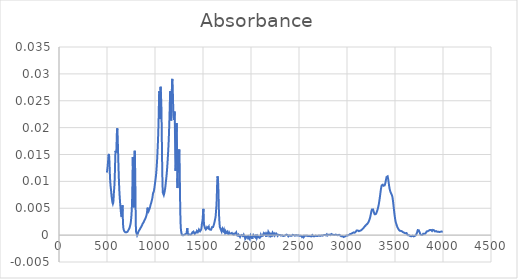
| Category | Absorbance |
|---|---|
| 3997.70514 | 0.001 |
| 3995.77668 | 0.001 |
| 3993.84822 | 0.001 |
| 3991.91975 | 0.001 |
| 3989.99129 | 0.001 |
| 3988.06283 | 0.001 |
| 3986.13436 | 0.001 |
| 3984.2059 | 0.001 |
| 3982.27743 | 0.001 |
| 3980.34897 | 0.001 |
| 3978.42051 | 0.001 |
| 3976.49204 | 0.001 |
| 3974.56358 | 0.001 |
| 3972.63512 | 0.001 |
| 3970.70665 | 0.001 |
| 3968.77819 | 0.001 |
| 3966.84973 | 0.001 |
| 3964.92126 | 0.001 |
| 3962.9928 | 0.001 |
| 3961.06433 | 0.001 |
| 3959.13587 | 0.001 |
| 3957.20741 | 0.001 |
| 3955.27894 | 0.001 |
| 3953.35048 | 0.001 |
| 3951.42202 | 0.001 |
| 3949.49355 | 0.001 |
| 3947.56509 | 0.001 |
| 3945.63663 | 0.001 |
| 3943.70816 | 0.001 |
| 3941.7797 | 0.001 |
| 3939.85123 | 0.001 |
| 3937.92277 | 0.001 |
| 3935.99431 | 0.001 |
| 3934.06584 | 0.001 |
| 3932.13738 | 0.001 |
| 3930.20892 | 0.001 |
| 3928.28045 | 0.001 |
| 3926.35199 | 0.001 |
| 3924.42353 | 0.001 |
| 3922.49506 | 0.001 |
| 3920.5666 | 0.001 |
| 3918.63813 | 0.001 |
| 3916.70967 | 0.001 |
| 3914.78121 | 0.001 |
| 3912.85274 | 0.001 |
| 3910.92428 | 0.001 |
| 3908.99582 | 0.001 |
| 3907.06735 | 0.001 |
| 3905.13889 | 0.001 |
| 3903.21043 | 0.001 |
| 3901.28196 | 0.001 |
| 3899.3535 | 0.001 |
| 3897.42503 | 0.001 |
| 3895.49657 | 0.001 |
| 3893.56811 | 0.001 |
| 3891.63964 | 0.001 |
| 3889.71118 | 0.001 |
| 3887.78272 | 0.001 |
| 3885.85425 | 0.001 |
| 3883.92579 | 0.001 |
| 3881.99733 | 0.001 |
| 3880.06886 | 0.001 |
| 3878.1404 | 0.001 |
| 3876.21193 | 0.001 |
| 3874.28347 | 0.001 |
| 3872.35501 | 0.001 |
| 3870.42654 | 0.001 |
| 3868.49808 | 0.001 |
| 3866.56962 | 0.001 |
| 3864.64115 | 0.001 |
| 3862.71269 | 0.001 |
| 3860.78422 | 0.001 |
| 3858.85576 | 0.001 |
| 3856.9273 | 0.001 |
| 3854.99883 | 0.001 |
| 3853.07037 | 0.001 |
| 3851.14191 | 0.001 |
| 3849.21344 | 0.001 |
| 3847.28498 | 0.001 |
| 3845.35652 | 0.001 |
| 3843.42805 | 0.001 |
| 3841.49959 | 0.001 |
| 3839.57112 | 0.001 |
| 3837.64266 | 0.001 |
| 3835.7142 | 0.001 |
| 3833.78573 | 0.001 |
| 3831.85727 | 0.001 |
| 3829.92881 | 0.001 |
| 3828.00034 | 0.001 |
| 3826.07188 | 0.001 |
| 3824.14342 | 0.001 |
| 3822.21495 | 0 |
| 3820.28649 | 0 |
| 3818.35802 | 0 |
| 3816.42956 | 0 |
| 3814.5011 | 0 |
| 3812.57263 | 0 |
| 3810.64417 | 0 |
| 3808.71571 | 0 |
| 3806.78724 | 0 |
| 3804.85878 | 0 |
| 3802.93032 | 0 |
| 3801.00185 | 0 |
| 3799.07339 | 0 |
| 3797.14492 | 0 |
| 3795.21646 | 0 |
| 3793.288 | 0 |
| 3791.35953 | 0 |
| 3789.43107 | 0 |
| 3787.50261 | 0 |
| 3785.57414 | 0 |
| 3783.64568 | 0 |
| 3781.71722 | 0 |
| 3779.78875 | 0 |
| 3777.86029 | 0 |
| 3775.93182 | 0 |
| 3774.00336 | 0 |
| 3772.0749 | 0 |
| 3770.14643 | 0 |
| 3768.21797 | 0 |
| 3766.28951 | 0 |
| 3764.36104 | 0 |
| 3762.43258 | 0 |
| 3760.50412 | 0 |
| 3758.57565 | 0 |
| 3756.64719 | 0.001 |
| 3754.71872 | 0.001 |
| 3752.79026 | 0.001 |
| 3750.8618 | 0.001 |
| 3748.93333 | 0.001 |
| 3747.00487 | 0.001 |
| 3745.07641 | 0.001 |
| 3743.14794 | 0.001 |
| 3741.21948 | 0.001 |
| 3739.29102 | 0.001 |
| 3737.36255 | 0.001 |
| 3735.43409 | 0.001 |
| 3733.50562 | 0.001 |
| 3731.57716 | 0.001 |
| 3729.6487 | 0 |
| 3727.72023 | 0 |
| 3725.79177 | 0 |
| 3723.86331 | 0 |
| 3721.93484 | 0 |
| 3720.00638 | 0 |
| 3718.07791 | 0 |
| 3716.14945 | 0 |
| 3714.22099 | 0 |
| 3712.29252 | 0 |
| 3710.36406 | 0 |
| 3708.4356 | 0 |
| 3706.50713 | 0 |
| 3704.57867 | 0 |
| 3702.65021 | 0 |
| 3700.72174 | 0 |
| 3698.79328 | 0 |
| 3696.86481 | 0 |
| 3694.93635 | 0 |
| 3693.00789 | 0 |
| 3691.07942 | 0 |
| 3689.15096 | 0 |
| 3687.2225 | 0 |
| 3685.29403 | 0 |
| 3683.36557 | 0 |
| 3681.43711 | 0 |
| 3679.50864 | 0 |
| 3677.58018 | 0 |
| 3675.65171 | 0 |
| 3673.72325 | 0 |
| 3671.79479 | 0 |
| 3669.86632 | 0 |
| 3667.93786 | 0 |
| 3666.0094 | 0 |
| 3664.08093 | 0 |
| 3662.15247 | 0 |
| 3660.22401 | 0 |
| 3658.29554 | 0 |
| 3656.36708 | 0 |
| 3654.43861 | 0 |
| 3652.51015 | 0 |
| 3650.58169 | 0 |
| 3648.65322 | 0 |
| 3646.72476 | 0 |
| 3644.7963 | 0 |
| 3642.86783 | 0 |
| 3640.93937 | 0 |
| 3639.01091 | 0 |
| 3637.08244 | 0 |
| 3635.15398 | 0 |
| 3633.22551 | 0 |
| 3631.29705 | 0 |
| 3629.36859 | 0 |
| 3627.44012 | 0 |
| 3625.51166 | 0 |
| 3623.5832 | 0 |
| 3621.65473 | 0 |
| 3619.72627 | 0 |
| 3617.79781 | 0 |
| 3615.86934 | 0 |
| 3613.94088 | 0 |
| 3612.01241 | 0 |
| 3610.08395 | 0 |
| 3608.15549 | 0 |
| 3606.22702 | 0 |
| 3604.29856 | 0 |
| 3602.3701 | 0 |
| 3600.44163 | 0 |
| 3598.51317 | 0 |
| 3596.58471 | 0 |
| 3594.65624 | 0 |
| 3592.72778 | 0 |
| 3590.79931 | 0.001 |
| 3588.87085 | 0.001 |
| 3586.94239 | 0.001 |
| 3585.01392 | 0.001 |
| 3583.08546 | 0.001 |
| 3581.157 | 0.001 |
| 3579.22853 | 0.001 |
| 3577.30007 | 0.001 |
| 3575.3716 | 0.001 |
| 3573.44314 | 0.001 |
| 3571.51468 | 0.001 |
| 3569.58621 | 0.001 |
| 3567.65775 | 0.001 |
| 3565.72929 | 0.001 |
| 3563.80082 | 0.001 |
| 3561.87236 | 0.001 |
| 3559.9439 | 0.001 |
| 3558.01543 | 0.001 |
| 3556.08697 | 0.001 |
| 3554.1585 | 0.001 |
| 3552.23004 | 0.001 |
| 3550.30158 | 0.001 |
| 3548.37311 | 0.001 |
| 3546.44465 | 0.001 |
| 3544.51619 | 0.001 |
| 3542.58772 | 0.001 |
| 3540.65926 | 0.001 |
| 3538.7308 | 0.001 |
| 3536.80233 | 0.001 |
| 3534.87387 | 0.001 |
| 3532.9454 | 0.001 |
| 3531.01694 | 0.001 |
| 3529.08848 | 0.001 |
| 3527.16001 | 0.001 |
| 3525.23155 | 0.001 |
| 3523.30309 | 0.002 |
| 3521.37462 | 0.002 |
| 3519.44616 | 0.002 |
| 3517.5177 | 0.002 |
| 3515.58923 | 0.002 |
| 3513.66077 | 0.002 |
| 3511.7323 | 0.002 |
| 3509.80384 | 0.002 |
| 3507.87538 | 0.002 |
| 3505.94691 | 0.003 |
| 3504.01845 | 0.003 |
| 3502.08999 | 0.003 |
| 3500.16152 | 0.003 |
| 3498.23306 | 0.003 |
| 3496.3046 | 0.004 |
| 3494.37613 | 0.004 |
| 3492.44767 | 0.004 |
| 3490.5192 | 0.005 |
| 3488.59074 | 0.005 |
| 3486.66228 | 0.005 |
| 3484.73381 | 0.005 |
| 3482.80535 | 0.006 |
| 3480.87689 | 0.006 |
| 3478.94842 | 0.006 |
| 3477.01996 | 0.007 |
| 3475.0915 | 0.007 |
| 3473.16303 | 0.007 |
| 3471.23457 | 0.007 |
| 3469.3061 | 0.007 |
| 3467.37764 | 0.007 |
| 3465.44918 | 0.008 |
| 3463.52071 | 0.008 |
| 3461.59225 | 0.008 |
| 3459.66379 | 0.008 |
| 3457.73532 | 0.008 |
| 3455.80686 | 0.008 |
| 3453.8784 | 0.008 |
| 3451.94993 | 0.008 |
| 3450.02147 | 0.008 |
| 3448.093 | 0.008 |
| 3446.16454 | 0.008 |
| 3444.23608 | 0.009 |
| 3442.30761 | 0.009 |
| 3440.37915 | 0.009 |
| 3438.45069 | 0.009 |
| 3436.52222 | 0.009 |
| 3434.59376 | 0.01 |
| 3432.66529 | 0.01 |
| 3430.73683 | 0.01 |
| 3428.80837 | 0.01 |
| 3426.8799 | 0.011 |
| 3424.95144 | 0.011 |
| 3423.02298 | 0.011 |
| 3421.09451 | 0.011 |
| 3419.16605 | 0.011 |
| 3417.23759 | 0.011 |
| 3415.30912 | 0.011 |
| 3413.38066 | 0.011 |
| 3411.45219 | 0.011 |
| 3409.52373 | 0.011 |
| 3407.59527 | 0.01 |
| 3405.6668 | 0.01 |
| 3403.73834 | 0.01 |
| 3401.80988 | 0.01 |
| 3399.88141 | 0.01 |
| 3397.95295 | 0.01 |
| 3396.02449 | 0.009 |
| 3394.09602 | 0.009 |
| 3392.16756 | 0.009 |
| 3390.23909 | 0.009 |
| 3388.31063 | 0.009 |
| 3386.38217 | 0.009 |
| 3384.4537 | 0.009 |
| 3382.52524 | 0.009 |
| 3380.59678 | 0.009 |
| 3378.66831 | 0.009 |
| 3376.73985 | 0.009 |
| 3374.81139 | 0.009 |
| 3372.88292 | 0.009 |
| 3370.95446 | 0.009 |
| 3369.02599 | 0.009 |
| 3367.09753 | 0.009 |
| 3365.16907 | 0.009 |
| 3363.2406 | 0.009 |
| 3361.31214 | 0.009 |
| 3359.38368 | 0.009 |
| 3357.45521 | 0.009 |
| 3355.52675 | 0.009 |
| 3353.59829 | 0.009 |
| 3351.66982 | 0.008 |
| 3349.74136 | 0.008 |
| 3347.81289 | 0.008 |
| 3345.88443 | 0.008 |
| 3343.95597 | 0.007 |
| 3342.0275 | 0.007 |
| 3340.09904 | 0.007 |
| 3338.17058 | 0.007 |
| 3336.24211 | 0.006 |
| 3334.31365 | 0.006 |
| 3332.38519 | 0.006 |
| 3330.45672 | 0.006 |
| 3328.52826 | 0.005 |
| 3326.59979 | 0.005 |
| 3324.67133 | 0.005 |
| 3322.74287 | 0.005 |
| 3320.8144 | 0.005 |
| 3318.88594 | 0.005 |
| 3316.95748 | 0.005 |
| 3315.02901 | 0.005 |
| 3313.10055 | 0.004 |
| 3311.17208 | 0.004 |
| 3309.24362 | 0.004 |
| 3307.31516 | 0.004 |
| 3305.38669 | 0.004 |
| 3303.45823 | 0.004 |
| 3301.52977 | 0.004 |
| 3299.6013 | 0.004 |
| 3297.67284 | 0.004 |
| 3295.74438 | 0.004 |
| 3293.81591 | 0.004 |
| 3291.88745 | 0.004 |
| 3289.95898 | 0.004 |
| 3288.03052 | 0.004 |
| 3286.10206 | 0.004 |
| 3284.17359 | 0.004 |
| 3282.24513 | 0.004 |
| 3280.31667 | 0.004 |
| 3278.3882 | 0.004 |
| 3276.45974 | 0.004 |
| 3274.53128 | 0.005 |
| 3272.60281 | 0.005 |
| 3270.67435 | 0.005 |
| 3268.74588 | 0.005 |
| 3266.81742 | 0.005 |
| 3264.88896 | 0.005 |
| 3262.96049 | 0.005 |
| 3261.03203 | 0.005 |
| 3259.10357 | 0.005 |
| 3257.1751 | 0.005 |
| 3255.24664 | 0.005 |
| 3253.31818 | 0.004 |
| 3251.38971 | 0.004 |
| 3249.46125 | 0.004 |
| 3247.53278 | 0.004 |
| 3245.60432 | 0.004 |
| 3243.67586 | 0.004 |
| 3241.74739 | 0.003 |
| 3239.81893 | 0.003 |
| 3237.89047 | 0.003 |
| 3235.962 | 0.003 |
| 3234.03354 | 0.003 |
| 3232.10508 | 0.003 |
| 3230.17661 | 0.003 |
| 3228.24815 | 0.003 |
| 3226.31968 | 0.003 |
| 3224.39122 | 0.002 |
| 3222.46276 | 0.002 |
| 3220.53429 | 0.002 |
| 3218.60583 | 0.002 |
| 3216.67737 | 0.002 |
| 3214.7489 | 0.002 |
| 3212.82044 | 0.002 |
| 3210.89198 | 0.002 |
| 3208.96351 | 0.002 |
| 3207.03505 | 0.002 |
| 3205.10658 | 0.002 |
| 3203.17812 | 0.002 |
| 3201.24966 | 0.002 |
| 3199.32119 | 0.002 |
| 3197.39273 | 0.002 |
| 3195.46427 | 0.002 |
| 3193.5358 | 0.002 |
| 3191.60734 | 0.002 |
| 3189.67888 | 0.002 |
| 3187.75041 | 0.002 |
| 3185.82195 | 0.002 |
| 3183.89348 | 0.002 |
| 3181.96502 | 0.002 |
| 3180.03656 | 0.002 |
| 3178.10809 | 0.001 |
| 3176.17963 | 0.001 |
| 3174.25117 | 0.001 |
| 3172.3227 | 0.001 |
| 3170.39424 | 0.001 |
| 3168.46577 | 0.001 |
| 3166.53731 | 0.001 |
| 3164.60885 | 0.001 |
| 3162.68038 | 0.001 |
| 3160.75192 | 0.001 |
| 3158.82346 | 0.001 |
| 3156.89499 | 0.001 |
| 3154.96653 | 0.001 |
| 3153.03807 | 0.001 |
| 3151.1096 | 0.001 |
| 3149.18114 | 0.001 |
| 3147.25267 | 0.001 |
| 3145.32421 | 0.001 |
| 3143.39575 | 0.001 |
| 3141.46728 | 0.001 |
| 3139.53882 | 0.001 |
| 3137.61036 | 0.001 |
| 3135.68189 | 0.001 |
| 3133.75343 | 0.001 |
| 3131.82497 | 0.001 |
| 3129.8965 | 0.001 |
| 3127.96804 | 0.001 |
| 3126.03957 | 0.001 |
| 3124.11111 | 0.001 |
| 3122.18265 | 0.001 |
| 3120.25418 | 0.001 |
| 3118.32572 | 0.001 |
| 3116.39726 | 0.001 |
| 3114.46879 | 0.001 |
| 3112.54033 | 0.001 |
| 3110.61187 | 0.001 |
| 3108.6834 | 0.001 |
| 3106.75494 | 0.001 |
| 3104.82647 | 0.001 |
| 3102.89801 | 0.001 |
| 3100.96955 | 0.001 |
| 3099.04108 | 0.001 |
| 3097.11262 | 0.001 |
| 3095.18416 | 0.001 |
| 3093.25569 | 0.001 |
| 3091.32723 | 0.001 |
| 3089.39877 | 0.001 |
| 3087.4703 | 0.001 |
| 3085.54184 | 0 |
| 3083.61337 | 0 |
| 3081.68491 | 0 |
| 3079.75645 | 0 |
| 3077.82798 | 0 |
| 3075.89952 | 0 |
| 3073.97106 | 0 |
| 3072.04259 | 0 |
| 3070.11413 | 0 |
| 3068.18567 | 0.001 |
| 3066.2572 | 0.001 |
| 3064.32874 | 0 |
| 3062.40027 | 0 |
| 3060.47181 | 0 |
| 3058.54335 | 0 |
| 3056.61488 | 0 |
| 3054.68642 | 0 |
| 3052.75796 | 0 |
| 3050.82949 | 0 |
| 3048.90103 | 0 |
| 3046.97257 | 0 |
| 3045.0441 | 0 |
| 3043.11564 | 0 |
| 3041.18717 | 0 |
| 3039.25871 | 0 |
| 3037.33025 | 0 |
| 3035.40178 | 0 |
| 3033.47332 | 0 |
| 3031.54486 | 0 |
| 3029.61639 | 0 |
| 3027.68793 | 0 |
| 3025.75946 | 0 |
| 3023.831 | 0 |
| 3021.90254 | 0 |
| 3019.97407 | 0 |
| 3018.04561 | 0 |
| 3016.11715 | 0 |
| 3014.18868 | 0 |
| 3012.26022 | 0 |
| 3010.33176 | 0 |
| 3008.40329 | 0 |
| 3006.47483 | 0 |
| 3004.54636 | 0 |
| 3002.6179 | 0 |
| 3000.68944 | 0 |
| 2998.76097 | 0 |
| 2996.83251 | 0 |
| 2994.90405 | 0 |
| 2992.97558 | 0 |
| 2991.04712 | 0 |
| 2989.11866 | 0 |
| 2987.19019 | 0 |
| 2985.26173 | 0 |
| 2983.33326 | 0 |
| 2981.4048 | 0 |
| 2979.47634 | 0 |
| 2977.54787 | 0 |
| 2975.61941 | 0 |
| 2973.69095 | 0 |
| 2971.76248 | 0 |
| 2969.83402 | 0 |
| 2967.90556 | 0 |
| 2965.97709 | 0 |
| 2964.04863 | 0 |
| 2962.12016 | 0 |
| 2960.1917 | 0 |
| 2958.26324 | 0 |
| 2956.33477 | 0 |
| 2954.40631 | 0 |
| 2952.47785 | 0 |
| 2950.54938 | 0 |
| 2948.62092 | 0 |
| 2946.69246 | 0 |
| 2944.76399 | 0 |
| 2942.83553 | 0 |
| 2940.90706 | 0 |
| 2938.9786 | 0 |
| 2937.05014 | 0 |
| 2935.12167 | 0 |
| 2933.19321 | 0 |
| 2931.26475 | 0 |
| 2929.33628 | 0 |
| 2927.40782 | 0 |
| 2925.47936 | 0 |
| 2923.55089 | 0 |
| 2921.62243 | 0 |
| 2919.69396 | 0 |
| 2917.7655 | 0 |
| 2915.83704 | 0 |
| 2913.90857 | 0 |
| 2911.98011 | 0 |
| 2910.05165 | 0 |
| 2908.12318 | 0 |
| 2906.19472 | 0 |
| 2904.26626 | 0 |
| 2902.33779 | 0 |
| 2900.40933 | 0 |
| 2898.48086 | 0 |
| 2896.5524 | 0 |
| 2894.62394 | 0 |
| 2892.69547 | 0 |
| 2890.76701 | 0 |
| 2888.83855 | 0 |
| 2886.91008 | 0 |
| 2884.98162 | 0 |
| 2883.05315 | 0 |
| 2881.12469 | 0 |
| 2879.19623 | 0 |
| 2877.26776 | 0 |
| 2875.3393 | 0 |
| 2873.41084 | 0 |
| 2871.48237 | 0 |
| 2869.55391 | 0 |
| 2867.62545 | 0 |
| 2865.69698 | 0 |
| 2863.76852 | 0 |
| 2861.84005 | 0 |
| 2859.91159 | 0 |
| 2857.98313 | 0 |
| 2856.05466 | 0 |
| 2854.1262 | 0 |
| 2852.19774 | 0 |
| 2850.26927 | 0 |
| 2848.34081 | 0 |
| 2846.41235 | 0 |
| 2844.48388 | 0 |
| 2842.55542 | 0 |
| 2840.62695 | 0 |
| 2838.69849 | 0 |
| 2836.77003 | 0 |
| 2834.84156 | 0 |
| 2832.9131 | 0 |
| 2830.98464 | 0 |
| 2829.05617 | 0 |
| 2827.12771 | 0 |
| 2825.19925 | 0 |
| 2823.27078 | 0 |
| 2821.34232 | 0 |
| 2819.41385 | 0 |
| 2817.48539 | 0 |
| 2815.55693 | 0 |
| 2813.62846 | 0 |
| 2811.7 | 0 |
| 2809.77154 | 0 |
| 2807.84307 | 0 |
| 2805.91461 | 0 |
| 2803.98615 | 0 |
| 2802.05768 | 0 |
| 2800.12922 | 0 |
| 2798.20075 | 0 |
| 2796.27229 | 0 |
| 2794.34383 | 0 |
| 2792.41536 | 0 |
| 2790.4869 | 0 |
| 2788.55844 | 0 |
| 2786.62997 | 0 |
| 2784.70151 | 0 |
| 2782.77305 | 0 |
| 2780.84458 | 0 |
| 2778.91612 | 0 |
| 2776.98765 | 0 |
| 2775.05919 | 0 |
| 2773.13073 | 0 |
| 2771.20226 | 0 |
| 2769.2738 | 0 |
| 2767.34534 | 0 |
| 2765.41687 | 0 |
| 2763.48841 | 0 |
| 2761.55995 | 0 |
| 2759.63148 | 0 |
| 2757.70302 | 0 |
| 2755.77455 | 0 |
| 2753.84609 | 0 |
| 2751.91763 | 0 |
| 2749.98916 | 0 |
| 2748.0607 | 0 |
| 2746.13224 | 0 |
| 2744.20377 | 0 |
| 2742.27531 | 0 |
| 2740.34684 | 0 |
| 2738.41838 | 0 |
| 2736.48992 | 0 |
| 2734.56145 | 0 |
| 2732.63299 | 0 |
| 2730.70453 | 0 |
| 2728.77606 | 0 |
| 2726.8476 | 0 |
| 2724.91914 | 0 |
| 2722.99067 | 0 |
| 2721.06221 | 0 |
| 2719.13374 | 0 |
| 2717.20528 | 0 |
| 2715.27682 | 0 |
| 2713.34835 | 0 |
| 2711.41989 | 0 |
| 2709.49143 | 0 |
| 2707.56296 | 0 |
| 2705.6345 | 0 |
| 2703.70604 | 0 |
| 2701.77757 | 0 |
| 2699.84911 | 0 |
| 2697.92064 | 0 |
| 2695.99218 | 0 |
| 2694.06372 | 0 |
| 2692.13525 | 0 |
| 2690.20679 | 0 |
| 2688.27833 | 0 |
| 2686.34986 | 0 |
| 2684.4214 | 0 |
| 2682.49294 | 0 |
| 2680.56447 | 0 |
| 2678.63601 | 0 |
| 2676.70754 | 0 |
| 2674.77908 | 0 |
| 2672.85062 | 0 |
| 2670.92215 | 0 |
| 2668.99369 | 0 |
| 2667.06523 | 0 |
| 2665.13676 | 0 |
| 2663.2083 | 0 |
| 2661.27984 | 0 |
| 2659.35137 | 0 |
| 2657.42291 | 0 |
| 2655.49444 | 0 |
| 2653.56598 | 0 |
| 2651.63752 | 0 |
| 2649.70905 | 0 |
| 2647.78059 | 0 |
| 2645.85213 | 0 |
| 2643.92366 | 0 |
| 2641.9952 | 0 |
| 2640.06674 | 0 |
| 2638.13827 | 0 |
| 2636.20981 | 0 |
| 2634.28134 | 0 |
| 2632.35288 | 0 |
| 2630.42442 | 0 |
| 2628.49595 | 0 |
| 2626.56749 | 0 |
| 2624.63903 | 0 |
| 2622.71056 | 0 |
| 2620.7821 | 0 |
| 2618.85364 | 0 |
| 2616.92517 | 0 |
| 2614.99671 | 0 |
| 2613.06824 | 0 |
| 2611.13978 | 0 |
| 2609.21132 | 0 |
| 2607.28285 | 0 |
| 2605.35439 | 0 |
| 2603.42593 | 0 |
| 2601.49746 | 0 |
| 2599.569 | 0 |
| 2597.64053 | 0 |
| 2595.71207 | 0 |
| 2593.78361 | 0 |
| 2591.85514 | 0 |
| 2589.92668 | 0 |
| 2587.99822 | 0 |
| 2586.06975 | 0 |
| 2584.14129 | 0 |
| 2582.21283 | 0 |
| 2580.28436 | 0 |
| 2578.3559 | 0 |
| 2576.42743 | 0 |
| 2574.49897 | 0 |
| 2572.57051 | 0 |
| 2570.64204 | 0 |
| 2568.71358 | 0 |
| 2566.78512 | 0 |
| 2564.85665 | 0 |
| 2562.92819 | 0 |
| 2560.99973 | 0 |
| 2559.07126 | 0 |
| 2557.1428 | 0 |
| 2555.21433 | 0 |
| 2553.28587 | 0 |
| 2551.35741 | 0 |
| 2549.42894 | 0 |
| 2547.50048 | 0 |
| 2545.57202 | 0 |
| 2543.64355 | 0 |
| 2541.71509 | 0 |
| 2539.78663 | 0 |
| 2537.85816 | 0 |
| 2535.9297 | 0 |
| 2534.00123 | 0 |
| 2532.07277 | 0 |
| 2530.14431 | 0 |
| 2528.21584 | 0 |
| 2526.28738 | 0 |
| 2524.35892 | 0 |
| 2522.43045 | 0 |
| 2520.50199 | 0 |
| 2518.57353 | 0 |
| 2516.64506 | 0 |
| 2514.7166 | 0 |
| 2512.78813 | 0 |
| 2510.85967 | 0 |
| 2508.93121 | 0 |
| 2507.00274 | 0 |
| 2505.07428 | 0 |
| 2503.14582 | 0 |
| 2501.21735 | 0 |
| 2499.28889 | 0 |
| 2497.36043 | 0 |
| 2495.43196 | 0 |
| 2493.5035 | 0 |
| 2491.57503 | 0 |
| 2489.64657 | 0 |
| 2487.71811 | 0 |
| 2485.78964 | 0 |
| 2483.86118 | 0 |
| 2481.93272 | 0 |
| 2480.00425 | 0 |
| 2478.07579 | 0 |
| 2476.14733 | 0 |
| 2474.21886 | 0 |
| 2472.2904 | 0 |
| 2470.36193 | 0 |
| 2468.43347 | 0 |
| 2466.50501 | 0 |
| 2464.57654 | 0 |
| 2462.64808 | 0 |
| 2460.71962 | 0 |
| 2458.79115 | 0 |
| 2456.86269 | 0 |
| 2454.93422 | 0 |
| 2453.00576 | 0 |
| 2451.0773 | 0 |
| 2449.14883 | 0 |
| 2447.22037 | 0 |
| 2445.29191 | 0 |
| 2443.36344 | 0 |
| 2441.43498 | 0 |
| 2439.50652 | 0 |
| 2437.57805 | 0 |
| 2435.64959 | 0 |
| 2433.72112 | 0 |
| 2431.79266 | 0 |
| 2429.8642 | 0 |
| 2427.93573 | 0 |
| 2426.00727 | 0 |
| 2424.07881 | 0 |
| 2422.15034 | 0 |
| 2420.22188 | 0 |
| 2418.29342 | 0 |
| 2416.36495 | 0 |
| 2414.43649 | 0 |
| 2412.50802 | 0 |
| 2410.57956 | 0 |
| 2408.6511 | 0 |
| 2406.72263 | 0 |
| 2404.79417 | 0 |
| 2402.86571 | 0 |
| 2400.93724 | 0 |
| 2399.00878 | 0 |
| 2397.08032 | 0 |
| 2395.15185 | 0 |
| 2393.22339 | 0 |
| 2391.29492 | 0 |
| 2389.36646 | 0 |
| 2387.438 | 0 |
| 2385.50953 | 0 |
| 2383.58107 | 0 |
| 2381.65261 | 0 |
| 2379.72414 | 0 |
| 2377.79568 | 0 |
| 2375.86722 | 0 |
| 2373.93875 | 0 |
| 2372.01029 | 0 |
| 2370.08182 | 0 |
| 2368.15336 | 0 |
| 2366.2249 | 0 |
| 2364.29643 | 0 |
| 2362.36797 | 0 |
| 2360.43951 | 0 |
| 2358.51104 | 0 |
| 2356.58258 | 0 |
| 2354.65412 | 0 |
| 2352.72565 | 0 |
| 2350.79719 | 0 |
| 2348.86872 | 0 |
| 2346.94026 | 0 |
| 2345.0118 | 0 |
| 2343.08333 | 0 |
| 2341.15487 | 0 |
| 2339.22641 | 0 |
| 2337.29794 | 0 |
| 2335.36948 | 0 |
| 2333.44102 | 0 |
| 2331.51255 | 0 |
| 2329.58409 | 0 |
| 2327.65562 | 0 |
| 2325.72716 | 0 |
| 2323.7987 | 0 |
| 2321.87023 | 0 |
| 2319.94177 | 0 |
| 2318.01331 | 0 |
| 2316.08484 | 0 |
| 2314.15638 | 0 |
| 2312.22791 | 0 |
| 2310.29945 | 0 |
| 2308.37099 | 0 |
| 2306.44252 | 0 |
| 2304.51406 | 0 |
| 2302.5856 | 0 |
| 2300.65713 | 0 |
| 2298.72867 | 0 |
| 2296.80021 | 0 |
| 2294.87174 | 0 |
| 2292.94328 | 0 |
| 2291.01481 | 0 |
| 2289.08635 | 0 |
| 2287.15789 | 0 |
| 2285.22942 | 0 |
| 2283.30096 | 0 |
| 2281.3725 | 0 |
| 2279.44403 | 0 |
| 2277.51557 | 0 |
| 2275.58711 | 0 |
| 2273.65864 | 0 |
| 2271.73018 | 0 |
| 2269.80171 | 0 |
| 2267.87325 | 0 |
| 2265.94479 | 0 |
| 2264.01632 | 0 |
| 2262.08786 | 0 |
| 2260.1594 | 0 |
| 2258.23093 | 0 |
| 2256.30247 | 0 |
| 2254.37401 | 0 |
| 2252.44554 | 0 |
| 2250.51708 | 0 |
| 2248.58861 | 0 |
| 2246.66015 | 0 |
| 2244.73169 | 0 |
| 2242.80322 | 0 |
| 2240.87476 | 0 |
| 2238.9463 | 0 |
| 2237.01783 | 0 |
| 2235.08937 | 0 |
| 2233.16091 | 0 |
| 2231.23244 | 0 |
| 2229.30398 | 0 |
| 2227.37551 | 0 |
| 2225.44705 | 0 |
| 2223.51859 | 0 |
| 2221.59012 | 0 |
| 2219.66166 | 0 |
| 2217.7332 | 0 |
| 2215.80473 | 0 |
| 2213.87627 | 0 |
| 2211.94781 | 0 |
| 2210.01934 | 0 |
| 2208.09088 | 0 |
| 2206.16241 | 0 |
| 2204.23395 | 0 |
| 2202.30549 | 0 |
| 2200.37702 | 0 |
| 2198.44856 | 0 |
| 2196.5201 | 0 |
| 2194.59163 | 0 |
| 2192.66317 | 0 |
| 2190.73471 | 0 |
| 2188.80624 | 0 |
| 2186.87778 | 0 |
| 2184.94931 | 0 |
| 2183.02085 | 0 |
| 2181.09239 | 0.001 |
| 2179.16392 | 0.001 |
| 2177.23546 | 0 |
| 2175.307 | 0 |
| 2173.37853 | 0 |
| 2171.45007 | 0 |
| 2169.5216 | 0 |
| 2167.59314 | 0 |
| 2165.66468 | 0 |
| 2163.73621 | 0 |
| 2161.80775 | 0 |
| 2159.87929 | 0 |
| 2157.95082 | 0 |
| 2156.02236 | 0 |
| 2154.0939 | 0 |
| 2152.16543 | 0 |
| 2150.23697 | 0 |
| 2148.3085 | 0 |
| 2146.38004 | 0 |
| 2144.45158 | 0 |
| 2142.52311 | 0 |
| 2140.59465 | 0 |
| 2138.66619 | 0 |
| 2136.73772 | 0 |
| 2134.80926 | 0 |
| 2132.8808 | 0 |
| 2130.95233 | 0 |
| 2129.02387 | 0 |
| 2127.0954 | 0 |
| 2125.16694 | 0 |
| 2123.23848 | 0 |
| 2121.31001 | 0 |
| 2119.38155 | 0 |
| 2117.45309 | 0 |
| 2115.52462 | 0 |
| 2113.59616 | 0 |
| 2111.6677 | 0 |
| 2109.73923 | 0 |
| 2107.81077 | 0 |
| 2105.8823 | 0 |
| 2103.95384 | 0 |
| 2102.02538 | 0 |
| 2100.09691 | 0 |
| 2098.16845 | 0 |
| 2096.23999 | 0 |
| 2094.31152 | 0 |
| 2092.38306 | 0 |
| 2090.4546 | -0.001 |
| 2088.52613 | -0.001 |
| 2086.59767 | 0 |
| 2084.6692 | 0 |
| 2082.74074 | 0 |
| 2080.81228 | 0 |
| 2078.88381 | 0 |
| 2076.95535 | 0 |
| 2075.02689 | 0 |
| 2073.09842 | 0 |
| 2071.16996 | 0 |
| 2069.2415 | 0 |
| 2067.31303 | 0 |
| 2065.38457 | 0 |
| 2063.4561 | 0 |
| 2061.52764 | -0.001 |
| 2059.59918 | 0 |
| 2057.67071 | 0 |
| 2055.74225 | 0 |
| 2053.81379 | 0 |
| 2051.88532 | 0 |
| 2049.95686 | 0 |
| 2048.0284 | 0 |
| 2046.09993 | -0.001 |
| 2044.17147 | -0.001 |
| 2042.243 | -0.001 |
| 2040.31454 | -0.001 |
| 2038.38608 | 0 |
| 2036.45761 | 0 |
| 2034.52915 | 0 |
| 2032.60069 | 0 |
| 2030.67222 | 0 |
| 2028.74376 | 0 |
| 2026.81529 | 0 |
| 2024.88683 | 0 |
| 2022.95837 | 0 |
| 2021.0299 | 0 |
| 2019.10144 | 0 |
| 2017.17298 | 0 |
| 2015.24451 | -0.001 |
| 2013.31605 | -0.001 |
| 2011.38759 | -0.001 |
| 2009.45912 | 0 |
| 2007.53066 | 0 |
| 2005.60219 | 0 |
| 2003.67373 | 0 |
| 2001.74527 | 0 |
| 1999.8168 | 0 |
| 1997.88834 | 0 |
| 1995.95988 | 0 |
| 1994.03141 | 0 |
| 1992.10295 | 0 |
| 1990.17449 | 0 |
| 1988.24602 | 0 |
| 1986.31756 | -0.001 |
| 1984.38909 | -0.001 |
| 1982.46063 | -0.001 |
| 1980.53217 | -0.001 |
| 1978.6037 | 0 |
| 1976.67524 | -0.001 |
| 1974.74678 | -0.001 |
| 1972.81831 | -0.001 |
| 1970.88985 | -0.001 |
| 1968.96139 | 0 |
| 1967.03292 | 0 |
| 1965.10446 | 0 |
| 1963.17599 | 0 |
| 1961.24753 | 0 |
| 1959.31907 | 0 |
| 1957.3906 | 0 |
| 1955.46214 | 0 |
| 1953.53368 | 0 |
| 1951.60521 | 0 |
| 1949.67675 | 0 |
| 1947.74829 | 0 |
| 1945.81982 | 0 |
| 1943.89136 | 0 |
| 1941.96289 | 0 |
| 1940.03443 | -0.001 |
| 1938.10597 | -0.001 |
| 1936.1775 | -0.001 |
| 1934.24904 | 0 |
| 1932.32058 | 0 |
| 1930.39211 | 0 |
| 1928.46365 | 0 |
| 1926.53519 | 0 |
| 1924.60672 | 0 |
| 1922.67826 | 0 |
| 1920.74979 | 0 |
| 1918.82133 | 0 |
| 1916.89287 | 0 |
| 1914.9644 | 0 |
| 1913.03594 | 0 |
| 1911.10748 | 0 |
| 1909.17901 | 0 |
| 1907.25055 | 0 |
| 1905.32209 | 0 |
| 1903.39362 | 0 |
| 1901.46516 | 0 |
| 1899.53669 | 0 |
| 1897.60823 | 0 |
| 1895.67977 | 0 |
| 1893.7513 | 0 |
| 1891.82284 | 0 |
| 1889.89438 | 0 |
| 1887.96591 | 0 |
| 1886.03745 | 0 |
| 1884.10898 | 0 |
| 1882.18052 | 0 |
| 1880.25206 | 0 |
| 1878.32359 | 0 |
| 1876.39513 | 0 |
| 1874.46667 | 0 |
| 1872.5382 | 0 |
| 1870.60974 | 0 |
| 1868.68128 | 0 |
| 1866.75281 | 0 |
| 1864.82435 | 0 |
| 1862.89588 | 0 |
| 1860.96742 | 0 |
| 1859.03896 | 0 |
| 1857.11049 | 0 |
| 1855.18203 | 0 |
| 1853.25357 | 0 |
| 1851.3251 | 0 |
| 1849.39664 | 0 |
| 1847.46818 | 0 |
| 1845.53971 | 0 |
| 1843.61125 | 0.001 |
| 1841.68278 | 0.001 |
| 1839.75432 | 0 |
| 1837.82586 | 0 |
| 1835.89739 | 0 |
| 1833.96893 | 0 |
| 1832.04047 | 0 |
| 1830.112 | 0 |
| 1828.18354 | 0 |
| 1826.25508 | 0 |
| 1824.32661 | 0 |
| 1822.39815 | 0 |
| 1820.46968 | 0 |
| 1818.54122 | 0 |
| 1816.61276 | 0 |
| 1814.68429 | 0 |
| 1812.75583 | 0 |
| 1810.82737 | 0 |
| 1808.8989 | 0 |
| 1806.97044 | 0 |
| 1805.04198 | 0 |
| 1803.11351 | 0 |
| 1801.18505 | 0 |
| 1799.25658 | 0 |
| 1797.32812 | 0 |
| 1795.39966 | 0 |
| 1793.47119 | 0 |
| 1791.54273 | 0 |
| 1789.61427 | 0 |
| 1787.6858 | 0 |
| 1785.75734 | 0 |
| 1783.82888 | 0 |
| 1781.90041 | 0 |
| 1779.97195 | 0 |
| 1778.04348 | 0 |
| 1776.11502 | 0 |
| 1774.18656 | 0 |
| 1772.25809 | 0.001 |
| 1770.32963 | 0.001 |
| 1768.40117 | 0 |
| 1766.4727 | 0 |
| 1764.54424 | 0 |
| 1762.61578 | 0 |
| 1760.68731 | 0 |
| 1758.75885 | 0 |
| 1756.83038 | 0 |
| 1754.90192 | 0 |
| 1752.97346 | 0 |
| 1751.04499 | 0.001 |
| 1749.11653 | 0.001 |
| 1747.18807 | 0.001 |
| 1745.2596 | 0.001 |
| 1743.33114 | 0.001 |
| 1741.40267 | 0.001 |
| 1739.47421 | 0 |
| 1737.54575 | 0 |
| 1735.61728 | 0.001 |
| 1733.68882 | 0.001 |
| 1731.76036 | 0.001 |
| 1729.83189 | 0.001 |
| 1727.90343 | 0 |
| 1725.97497 | 0 |
| 1724.0465 | 0.001 |
| 1722.11804 | 0.001 |
| 1720.18957 | 0.001 |
| 1718.26111 | 0.001 |
| 1716.33265 | 0.001 |
| 1714.40418 | 0.001 |
| 1712.47572 | 0.001 |
| 1710.54726 | 0.001 |
| 1708.61879 | 0.001 |
| 1706.69033 | 0.001 |
| 1704.76187 | 0.001 |
| 1702.8334 | 0.001 |
| 1700.90494 | 0.001 |
| 1698.97647 | 0.001 |
| 1697.04801 | 0.001 |
| 1695.11955 | 0.001 |
| 1693.19108 | 0.001 |
| 1691.26262 | 0.001 |
| 1689.33416 | 0.001 |
| 1687.40569 | 0.001 |
| 1685.47723 | 0.001 |
| 1683.54877 | 0.001 |
| 1681.6203 | 0.001 |
| 1679.69184 | 0.001 |
| 1677.76337 | 0.001 |
| 1675.83491 | 0.001 |
| 1673.90645 | 0.002 |
| 1671.97798 | 0.002 |
| 1670.04952 | 0.003 |
| 1668.12106 | 0.003 |
| 1666.19259 | 0.004 |
| 1664.26413 | 0.006 |
| 1662.33567 | 0.007 |
| 1660.4072 | 0.008 |
| 1658.47874 | 0.009 |
| 1656.55027 | 0.01 |
| 1654.62181 | 0.011 |
| 1652.69335 | 0.011 |
| 1650.76488 | 0.011 |
| 1648.83642 | 0.01 |
| 1646.90796 | 0.009 |
| 1644.97949 | 0.008 |
| 1643.05103 | 0.007 |
| 1641.12257 | 0.006 |
| 1639.1941 | 0.005 |
| 1637.26564 | 0.005 |
| 1635.33717 | 0.004 |
| 1633.40871 | 0.004 |
| 1631.48025 | 0.003 |
| 1629.55178 | 0.003 |
| 1627.62332 | 0.003 |
| 1625.69486 | 0.003 |
| 1623.76639 | 0.003 |
| 1621.83793 | 0.003 |
| 1619.90946 | 0.002 |
| 1617.981 | 0.002 |
| 1616.05254 | 0.002 |
| 1614.12407 | 0.002 |
| 1612.19561 | 0.002 |
| 1610.26715 | 0.002 |
| 1608.33868 | 0.002 |
| 1606.41022 | 0.002 |
| 1604.48176 | 0.002 |
| 1602.55329 | 0.001 |
| 1600.62483 | 0.001 |
| 1598.69636 | 0.001 |
| 1596.7679 | 0.001 |
| 1594.83944 | 0.002 |
| 1592.91097 | 0.001 |
| 1590.98251 | 0.001 |
| 1589.05405 | 0.001 |
| 1587.12558 | 0.001 |
| 1585.19712 | 0.001 |
| 1583.26866 | 0.001 |
| 1581.34019 | 0.001 |
| 1579.41173 | 0.001 |
| 1577.48326 | 0.001 |
| 1575.5548 | 0.001 |
| 1573.62634 | 0.001 |
| 1571.69787 | 0.001 |
| 1569.76941 | 0.001 |
| 1567.84095 | 0.001 |
| 1565.91248 | 0.001 |
| 1563.98402 | 0.001 |
| 1562.05556 | 0.001 |
| 1560.12709 | 0.002 |
| 1558.19863 | 0.002 |
| 1556.27016 | 0.001 |
| 1554.3417 | 0.001 |
| 1552.41324 | 0.001 |
| 1550.48477 | 0.001 |
| 1548.55631 | 0.001 |
| 1546.62785 | 0.001 |
| 1544.69938 | 0.001 |
| 1542.77092 | 0.001 |
| 1540.84246 | 0.002 |
| 1538.91399 | 0.001 |
| 1536.98553 | 0.001 |
| 1535.05706 | 0.001 |
| 1533.1286 | 0.001 |
| 1531.20014 | 0.001 |
| 1529.27167 | 0.001 |
| 1527.34321 | 0.001 |
| 1525.41475 | 0.001 |
| 1523.48628 | 0.001 |
| 1521.55782 | 0.001 |
| 1519.62936 | 0.001 |
| 1517.70089 | 0.001 |
| 1515.77243 | 0.001 |
| 1513.84396 | 0.001 |
| 1511.9155 | 0.001 |
| 1509.98704 | 0.002 |
| 1508.05857 | 0.003 |
| 1506.13011 | 0.004 |
| 1504.20165 | 0.005 |
| 1502.27318 | 0.005 |
| 1500.34472 | 0.004 |
| 1498.41626 | 0.004 |
| 1496.48779 | 0.003 |
| 1494.55933 | 0.003 |
| 1492.63086 | 0.002 |
| 1490.7024 | 0.002 |
| 1488.77394 | 0.002 |
| 1486.84547 | 0.002 |
| 1484.91701 | 0.001 |
| 1482.98855 | 0.001 |
| 1481.06008 | 0.001 |
| 1479.13162 | 0.001 |
| 1477.20315 | 0.001 |
| 1475.27469 | 0.001 |
| 1473.34623 | 0.001 |
| 1471.41776 | 0.001 |
| 1469.4893 | 0.001 |
| 1467.56084 | 0.001 |
| 1465.63237 | 0.001 |
| 1463.70391 | 0.001 |
| 1461.77545 | 0.001 |
| 1459.84698 | 0.001 |
| 1457.91852 | 0.001 |
| 1455.99005 | 0.001 |
| 1454.06159 | 0.001 |
| 1452.13313 | 0.001 |
| 1450.20466 | 0.001 |
| 1448.2762 | 0.001 |
| 1446.34774 | 0.001 |
| 1444.41927 | 0 |
| 1442.49081 | 0 |
| 1440.56235 | 0 |
| 1438.63388 | 0.001 |
| 1436.70542 | 0.001 |
| 1434.77695 | 0.001 |
| 1432.84849 | 0.001 |
| 1430.92003 | 0 |
| 1428.99156 | 0 |
| 1427.0631 | 0 |
| 1425.13464 | 0 |
| 1423.20617 | 0 |
| 1421.27771 | 0.001 |
| 1419.34925 | 0.001 |
| 1417.42078 | 0.001 |
| 1415.49232 | 0 |
| 1413.56385 | 0 |
| 1411.63539 | 0 |
| 1409.70693 | 0 |
| 1407.77846 | 0 |
| 1405.85 | 0 |
| 1403.92154 | 0 |
| 1401.99307 | 0.001 |
| 1400.06461 | 0.001 |
| 1398.13615 | 0.001 |
| 1396.20768 | 0.001 |
| 1394.27922 | 0.001 |
| 1392.35075 | 0.001 |
| 1390.42229 | 0 |
| 1388.49383 | 0 |
| 1386.56536 | 0 |
| 1384.6369 | 0 |
| 1382.70844 | 0 |
| 1380.77997 | 0 |
| 1378.85151 | 0 |
| 1376.92305 | 0 |
| 1374.99458 | 0 |
| 1373.06612 | 0 |
| 1371.13765 | 0 |
| 1369.20919 | 0 |
| 1367.28073 | 0 |
| 1365.35226 | 0 |
| 1363.4238 | 0 |
| 1361.49534 | 0 |
| 1359.56687 | 0 |
| 1357.63841 | 0 |
| 1355.70995 | 0 |
| 1353.78148 | 0 |
| 1351.85302 | 0 |
| 1349.92455 | 0 |
| 1347.99609 | 0 |
| 1346.06763 | 0 |
| 1344.13916 | 0 |
| 1342.2107 | 0 |
| 1340.28224 | 0.001 |
| 1338.35377 | 0.001 |
| 1336.42531 | 0.001 |
| 1334.49684 | 0.001 |
| 1332.56838 | 0.001 |
| 1330.63992 | 0.001 |
| 1328.71145 | 0 |
| 1326.78299 | 0 |
| 1324.85453 | 0 |
| 1322.92606 | 0 |
| 1320.9976 | 0 |
| 1319.06914 | 0 |
| 1317.14067 | 0 |
| 1315.21221 | 0 |
| 1313.28374 | 0 |
| 1311.35528 | 0 |
| 1309.42682 | 0 |
| 1307.49835 | 0 |
| 1305.56989 | 0 |
| 1303.64143 | 0 |
| 1301.71296 | 0 |
| 1299.7845 | 0 |
| 1297.85604 | 0 |
| 1295.92757 | 0 |
| 1293.99911 | 0 |
| 1292.07064 | 0 |
| 1290.14218 | 0 |
| 1288.21372 | 0 |
| 1286.28525 | 0 |
| 1284.35679 | 0 |
| 1282.42833 | 0 |
| 1280.49986 | 0 |
| 1278.5714 | 0 |
| 1276.64294 | 0 |
| 1274.71447 | 0 |
| 1272.78601 | 0.001 |
| 1270.85754 | 0.001 |
| 1268.92908 | 0.001 |
| 1267.00062 | 0.002 |
| 1265.07215 | 0.003 |
| 1263.14369 | 0.005 |
| 1261.21523 | 0.007 |
| 1259.28676 | 0.01 |
| 1257.3583 | 0.012 |
| 1255.42984 | 0.015 |
| 1253.50137 | 0.016 |
| 1251.57291 | 0.016 |
| 1249.64444 | 0.015 |
| 1247.71598 | 0.015 |
| 1245.78752 | 0.015 |
| 1243.85905 | 0.015 |
| 1241.93059 | 0.015 |
| 1240.00213 | 0.014 |
| 1238.07366 | 0.011 |
| 1236.1452 | 0.009 |
| 1234.21674 | 0.009 |
| 1232.28827 | 0.011 |
| 1230.35981 | 0.014 |
| 1228.43134 | 0.018 |
| 1226.50288 | 0.02 |
| 1224.57442 | 0.021 |
| 1222.64595 | 0.019 |
| 1220.71749 | 0.017 |
| 1218.78903 | 0.014 |
| 1216.86056 | 0.013 |
| 1214.9321 | 0.012 |
| 1213.00364 | 0.012 |
| 1211.07517 | 0.014 |
| 1209.14671 | 0.017 |
| 1207.21824 | 0.02 |
| 1205.28978 | 0.023 |
| 1203.36132 | 0.023 |
| 1201.43285 | 0.022 |
| 1199.50439 | 0.021 |
| 1197.57593 | 0.021 |
| 1195.64746 | 0.022 |
| 1193.719 | 0.022 |
| 1191.79053 | 0.023 |
| 1189.86207 | 0.024 |
| 1187.93361 | 0.025 |
| 1186.00514 | 0.026 |
| 1184.07668 | 0.028 |
| 1182.14822 | 0.029 |
| 1180.21975 | 0.029 |
| 1178.29129 | 0.029 |
| 1176.36283 | 0.028 |
| 1174.43436 | 0.026 |
| 1172.5059 | 0.024 |
| 1170.57743 | 0.022 |
| 1168.64897 | 0.021 |
| 1166.72051 | 0.022 |
| 1164.79204 | 0.024 |
| 1162.86358 | 0.026 |
| 1160.93512 | 0.027 |
| 1159.00665 | 0.027 |
| 1157.07819 | 0.026 |
| 1155.14973 | 0.025 |
| 1153.22126 | 0.024 |
| 1151.2928 | 0.022 |
| 1149.36433 | 0.021 |
| 1147.43587 | 0.02 |
| 1145.50741 | 0.019 |
| 1143.57894 | 0.018 |
| 1141.65048 | 0.017 |
| 1139.72202 | 0.016 |
| 1137.79355 | 0.016 |
| 1135.86509 | 0.015 |
| 1133.93663 | 0.015 |
| 1132.00816 | 0.014 |
| 1130.0797 | 0.013 |
| 1128.15123 | 0.013 |
| 1126.22277 | 0.012 |
| 1124.29431 | 0.012 |
| 1122.36584 | 0.012 |
| 1120.43738 | 0.011 |
| 1118.50892 | 0.011 |
| 1116.58045 | 0.01 |
| 1114.65199 | 0.01 |
| 1112.72353 | 0.01 |
| 1110.79506 | 0.009 |
| 1108.8666 | 0.009 |
| 1106.93813 | 0.009 |
| 1105.00967 | 0.009 |
| 1103.08121 | 0.008 |
| 1101.15274 | 0.008 |
| 1099.22428 | 0.008 |
| 1097.29582 | 0.008 |
| 1095.36735 | 0.008 |
| 1093.43889 | 0.008 |
| 1091.51043 | 0.007 |
| 1089.58196 | 0.007 |
| 1087.6535 | 0.007 |
| 1085.72503 | 0.007 |
| 1083.79657 | 0.008 |
| 1081.86811 | 0.008 |
| 1079.93964 | 0.009 |
| 1078.01118 | 0.01 |
| 1076.08272 | 0.012 |
| 1074.15425 | 0.014 |
| 1072.22579 | 0.016 |
| 1070.29733 | 0.019 |
| 1068.36886 | 0.022 |
| 1066.4404 | 0.024 |
| 1064.51193 | 0.025 |
| 1062.58347 | 0.026 |
| 1060.65501 | 0.027 |
| 1058.72654 | 0.028 |
| 1056.79808 | 0.027 |
| 1054.86962 | 0.025 |
| 1052.94115 | 0.023 |
| 1051.01269 | 0.022 |
| 1049.08422 | 0.023 |
| 1047.15576 | 0.025 |
| 1045.2273 | 0.027 |
| 1043.29883 | 0.026 |
| 1041.37037 | 0.025 |
| 1039.44191 | 0.023 |
| 1037.51344 | 0.021 |
| 1035.58498 | 0.02 |
| 1033.65652 | 0.019 |
| 1031.72805 | 0.018 |
| 1029.79959 | 0.017 |
| 1027.87112 | 0.016 |
| 1025.94266 | 0.015 |
| 1024.0142 | 0.015 |
| 1022.08573 | 0.014 |
| 1020.15727 | 0.013 |
| 1018.22881 | 0.013 |
| 1016.30034 | 0.012 |
| 1014.37188 | 0.012 |
| 1012.44342 | 0.012 |
| 1010.51495 | 0.011 |
| 1008.58649 | 0.011 |
| 1006.65802 | 0.011 |
| 1004.72956 | 0.01 |
| 1002.8011 | 0.01 |
| 1000.87263 | 0.01 |
| 998.94417 | 0.009 |
| 997.01571 | 0.009 |
| 995.08724 | 0.009 |
| 993.15878 | 0.009 |
| 991.23032 | 0.008 |
| 989.30185 | 0.008 |
| 987.37339 | 0.008 |
| 985.44492 | 0.008 |
| 983.51646 | 0.008 |
| 981.588 | 0.008 |
| 979.65953 | 0.008 |
| 977.73107 | 0.008 |
| 975.80261 | 0.007 |
| 973.87414 | 0.007 |
| 971.94568 | 0.007 |
| 970.01722 | 0.007 |
| 968.08875 | 0.007 |
| 966.16029 | 0.006 |
| 964.23182 | 0.006 |
| 962.30336 | 0.006 |
| 960.3749 | 0.006 |
| 958.44643 | 0.006 |
| 956.51797 | 0.006 |
| 954.58951 | 0.006 |
| 952.66104 | 0.006 |
| 950.73258 | 0.005 |
| 948.80412 | 0.005 |
| 946.87565 | 0.005 |
| 944.94719 | 0.005 |
| 943.01872 | 0.005 |
| 941.09026 | 0.005 |
| 939.1618 | 0.005 |
| 937.23333 | 0.005 |
| 935.30487 | 0.005 |
| 933.37641 | 0.004 |
| 931.44794 | 0.004 |
| 929.51948 | 0.004 |
| 927.59102 | 0.005 |
| 925.66255 | 0.005 |
| 923.73409 | 0.005 |
| 921.80562 | 0.005 |
| 919.87716 | 0.005 |
| 917.9487 | 0.004 |
| 916.02023 | 0.004 |
| 914.09177 | 0.004 |
| 912.16331 | 0.004 |
| 910.23484 | 0.004 |
| 908.30638 | 0.004 |
| 906.37791 | 0.003 |
| 904.44945 | 0.003 |
| 902.52099 | 0.003 |
| 900.59252 | 0.003 |
| 898.66406 | 0.003 |
| 896.7356 | 0.003 |
| 894.80713 | 0.003 |
| 892.87867 | 0.003 |
| 890.95021 | 0.003 |
| 889.02174 | 0.003 |
| 887.09328 | 0.003 |
| 885.16481 | 0.003 |
| 883.23635 | 0.002 |
| 881.30789 | 0.002 |
| 879.37942 | 0.002 |
| 877.45096 | 0.002 |
| 875.5225 | 0.002 |
| 873.59403 | 0.002 |
| 871.66557 | 0.002 |
| 869.73711 | 0.002 |
| 867.80864 | 0.002 |
| 865.88018 | 0.002 |
| 863.95171 | 0.002 |
| 862.02325 | 0.002 |
| 860.09479 | 0.002 |
| 858.16632 | 0.002 |
| 856.23786 | 0.002 |
| 854.3094 | 0.001 |
| 852.38093 | 0.001 |
| 850.45247 | 0.001 |
| 848.52401 | 0.001 |
| 846.59554 | 0.001 |
| 844.66708 | 0.001 |
| 842.73861 | 0.001 |
| 840.81015 | 0.001 |
| 838.88169 | 0.001 |
| 836.95322 | 0.001 |
| 835.02476 | 0.001 |
| 833.0963 | 0.001 |
| 831.16783 | 0.001 |
| 829.23937 | 0.001 |
| 827.31091 | 0.001 |
| 825.38244 | 0.001 |
| 823.45398 | 0 |
| 821.52551 | 0 |
| 819.59705 | 0 |
| 817.66859 | 0 |
| 815.74012 | 0 |
| 813.81166 | 0 |
| 811.8832 | 0 |
| 809.95473 | 0 |
| 808.02627 | 0 |
| 806.09781 | 0 |
| 804.16934 | 0 |
| 802.24088 | 0.001 |
| 800.31241 | 0.002 |
| 798.38395 | 0.004 |
| 796.45549 | 0.008 |
| 794.52702 | 0.011 |
| 792.59856 | 0.013 |
| 790.6701 | 0.015 |
| 788.74163 | 0.016 |
| 786.81317 | 0.014 |
| 784.88471 | 0.011 |
| 782.95624 | 0.008 |
| 781.02778 | 0.006 |
| 779.09931 | 0.005 |
| 777.17085 | 0.006 |
| 775.24239 | 0.008 |
| 773.31392 | 0.011 |
| 771.38546 | 0.014 |
| 769.457 | 0.015 |
| 767.52853 | 0.013 |
| 765.60007 | 0.01 |
| 763.6716 | 0.008 |
| 761.74314 | 0.007 |
| 759.81468 | 0.006 |
| 757.88621 | 0.005 |
| 755.95775 | 0.004 |
| 754.02929 | 0.004 |
| 752.10082 | 0.003 |
| 750.17236 | 0.003 |
| 748.2439 | 0.002 |
| 746.31543 | 0.002 |
| 744.38697 | 0.002 |
| 742.4585 | 0.002 |
| 740.53004 | 0.002 |
| 738.60158 | 0.002 |
| 736.67311 | 0.001 |
| 734.74465 | 0.001 |
| 732.81619 | 0.001 |
| 730.88772 | 0.001 |
| 728.95926 | 0.001 |
| 727.0308 | 0.001 |
| 725.10233 | 0.001 |
| 723.17387 | 0.001 |
| 721.2454 | 0.001 |
| 719.31694 | 0.001 |
| 717.38848 | 0.001 |
| 715.46001 | 0.001 |
| 713.53155 | 0.001 |
| 711.60309 | 0.001 |
| 709.67462 | 0.001 |
| 707.74616 | 0.001 |
| 705.8177 | 0.001 |
| 703.88923 | 0.001 |
| 701.96077 | 0.001 |
| 700.0323 | 0 |
| 698.10384 | 0 |
| 696.17538 | 0 |
| 694.24691 | 0 |
| 692.31845 | 0.001 |
| 690.38999 | 0.001 |
| 688.46152 | 0.001 |
| 686.53306 | 0 |
| 684.6046 | 0.001 |
| 682.67613 | 0.001 |
| 680.74767 | 0.001 |
| 678.8192 | 0.001 |
| 676.89074 | 0.001 |
| 674.96228 | 0.001 |
| 673.03381 | 0.001 |
| 671.10535 | 0.001 |
| 669.17689 | 0.002 |
| 667.24842 | 0.002 |
| 665.31996 | 0.003 |
| 663.3915 | 0.005 |
| 661.46303 | 0.006 |
| 659.53457 | 0.005 |
| 657.6061 | 0.004 |
| 655.67764 | 0.004 |
| 653.74918 | 0.003 |
| 651.82071 | 0.003 |
| 649.89225 | 0.004 |
| 647.96379 | 0.004 |
| 646.03532 | 0.004 |
| 644.10686 | 0.004 |
| 642.1784 | 0.005 |
| 640.24993 | 0.005 |
| 638.32147 | 0.006 |
| 636.393 | 0.006 |
| 634.46454 | 0.007 |
| 632.53608 | 0.007 |
| 630.60761 | 0.008 |
| 628.67915 | 0.008 |
| 626.75069 | 0.009 |
| 624.82222 | 0.01 |
| 622.89376 | 0.011 |
| 620.96529 | 0.012 |
| 619.03683 | 0.013 |
| 617.10837 | 0.014 |
| 615.1799 | 0.016 |
| 613.25144 | 0.017 |
| 611.32298 | 0.018 |
| 609.39451 | 0.019 |
| 607.46605 | 0.02 |
| 605.53759 | 0.02 |
| 603.60912 | 0.019 |
| 601.68066 | 0.018 |
| 599.75219 | 0.017 |
| 597.82373 | 0.016 |
| 595.89527 | 0.015 |
| 593.9668 | 0.015 |
| 592.03834 | 0.015 |
| 590.10988 | 0.016 |
| 588.18141 | 0.015 |
| 586.25295 | 0.015 |
| 584.32449 | 0.013 |
| 582.39602 | 0.012 |
| 580.46756 | 0.011 |
| 578.53909 | 0.01 |
| 576.61063 | 0.009 |
| 574.68217 | 0.009 |
| 572.7537 | 0.008 |
| 570.82524 | 0.008 |
| 568.89678 | 0.007 |
| 566.96831 | 0.006 |
| 565.03985 | 0.006 |
| 563.11139 | 0.006 |
| 561.18292 | 0.006 |
| 559.25446 | 0.006 |
| 557.32599 | 0.006 |
| 555.39753 | 0.006 |
| 553.46907 | 0.006 |
| 551.5406 | 0.007 |
| 549.61214 | 0.007 |
| 547.68368 | 0.007 |
| 545.75521 | 0.008 |
| 543.82675 | 0.008 |
| 541.89829 | 0.008 |
| 539.96982 | 0.009 |
| 538.04136 | 0.009 |
| 536.11289 | 0.009 |
| 534.18443 | 0.01 |
| 532.25597 | 0.01 |
| 530.3275 | 0.011 |
| 528.39904 | 0.012 |
| 526.47058 | 0.013 |
| 524.54211 | 0.014 |
| 522.61365 | 0.015 |
| 520.68519 | 0.015 |
| 518.75672 | 0.015 |
| 516.82826 | 0.015 |
| 514.89979 | 0.015 |
| 512.97133 | 0.014 |
| 511.04287 | 0.014 |
| 509.1144 | 0.013 |
| 507.18594 | 0.013 |
| 505.25748 | 0.013 |
| 503.32901 | 0.012 |
| 501.40055 | 0.012 |
| 499.47209 | 0.012 |